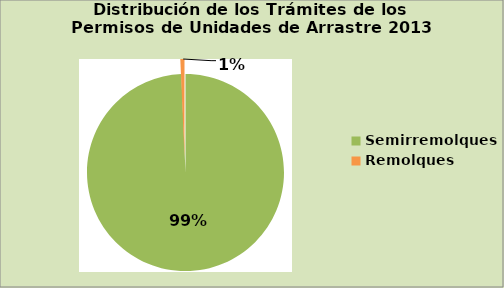
| Category | Series 0 |
|---|---|
| Semirremolques | 99.32 |
| Remolques | 0.68 |